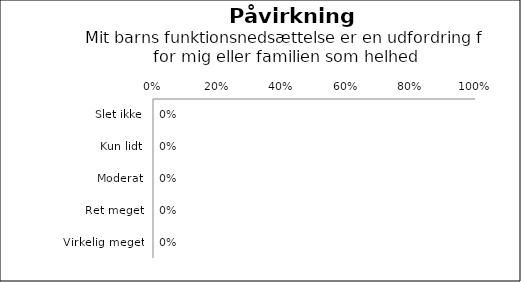
| Category | Påvirkning af familie |
|---|---|
| Slet ikke | 0 |
| Kun lidt | 0 |
| Moderat | 0 |
| Ret meget | 0 |
| Virkelig meget | 0 |